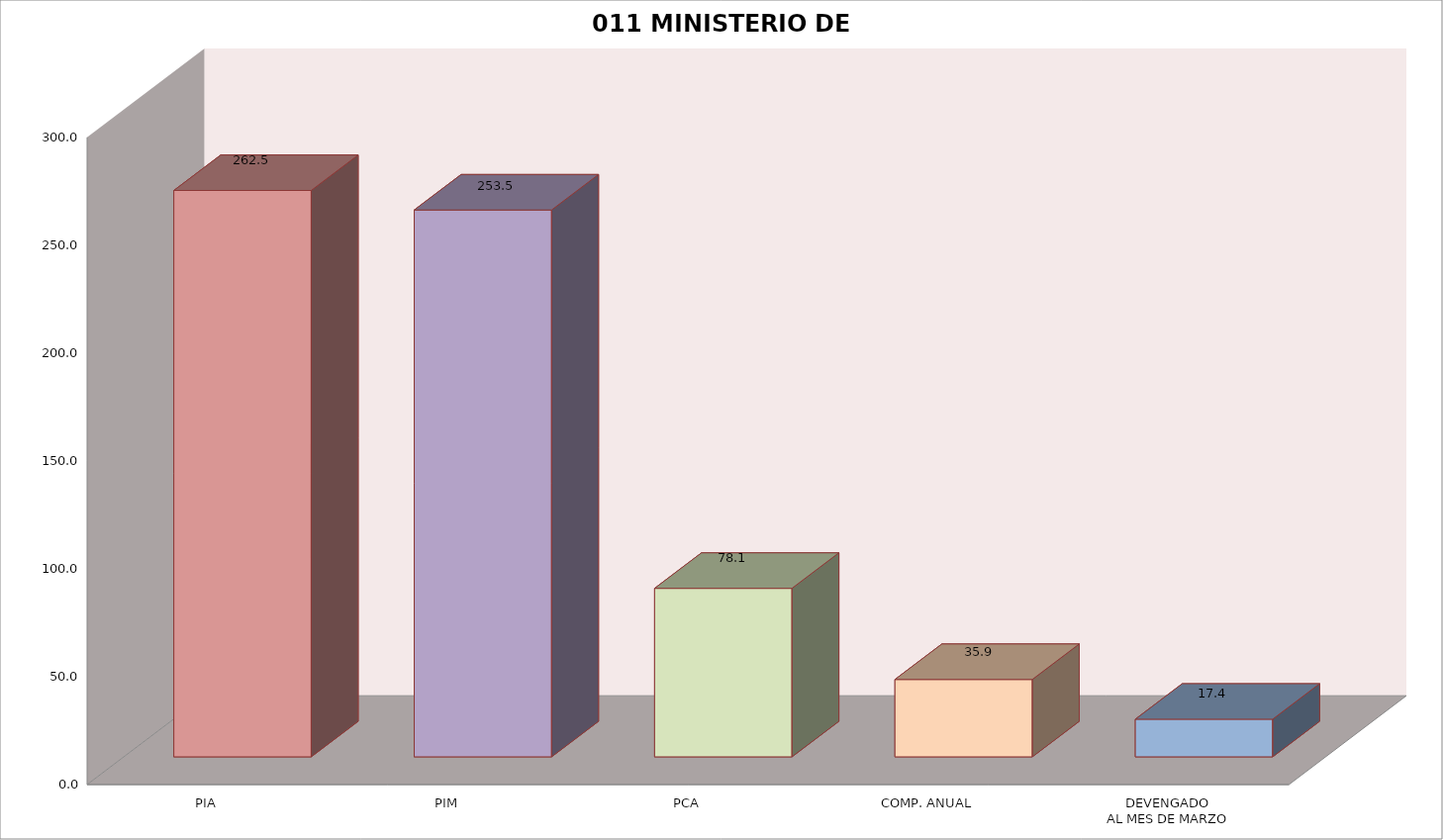
| Category | 011 MINISTERIO DE SALUD |
|---|---|
| PIA | 262.508 |
| PIM | 253.454 |
| PCA | 78.097 |
| COMP. ANUAL | 35.859 |
| DEVENGADO
AL MES DE MARZO | 17.442 |